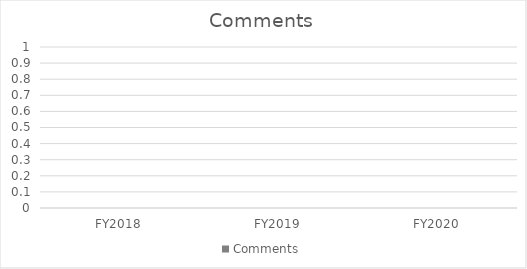
| Category | Comments |
|---|---|
| FY2018 | 0 |
| FY2019 | 0 |
| FY2020 | 0 |